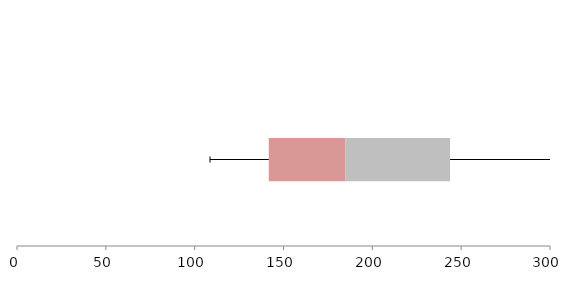
| Category | Series 1 | Series 2 | Series 3 |
|---|---|---|---|
| 0 | 141.715 | 43.045 | 59.007 |